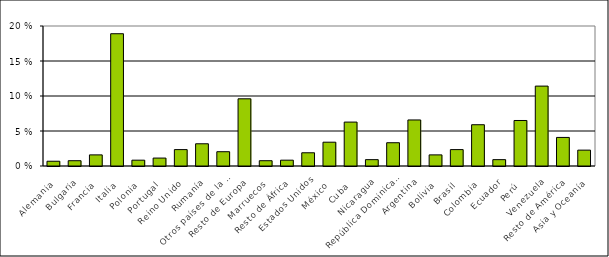
| Category | Series 0 |
|---|---|
| Alemania | 0.68 |
| Bulgaria | 0.756 |
| Francia | 1.587 |
| Italia | 18.896 |
| Polonia | 0.831 |
| Portugal | 1.134 |
| Reino Unido | 2.343 |
| Rumanía | 3.175 |
| Otros países de la UE | 2.041 |
| Resto de Europa | 9.599 |
| Marruecos | 0.756 |
| Resto de África | 0.831 |
| Estados Unidos | 1.89 |
| México | 3.401 |
| Cuba | 6.274 |
| Nicaragua | 0.907 |
| República Dominicana | 3.326 |
| Argentina | 6.576 |
| Bolivia | 1.587 |
| Brasil | 2.343 |
| Colombia | 5.896 |
| Ecuador | 0.907 |
| Perú | 6.5 |
| Venezuela | 11.413 |
| Resto de América | 4.082 |
| Asia y Oceanía | 2.268 |